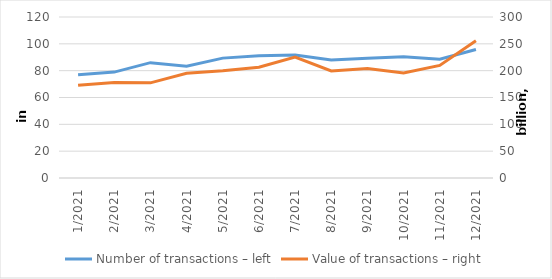
| Category | Number of transactions – left |
|---|---|
| 1/2021 | 77010690 |
| 2/2021 | 78931977 |
| 3/2021 | 85968718 |
| 4/2021 | 83362668 |
| 5/2021 | 89350925 |
| 6/2021 | 91130296 |
| 7/2021 | 91679956 |
| 8/2021 | 87868501 |
| 9/2021 | 89277528 |
| 10/2021 | 90415693 |
| 11/2021 | 88536718 |
| 12/2021 | 95819366 |